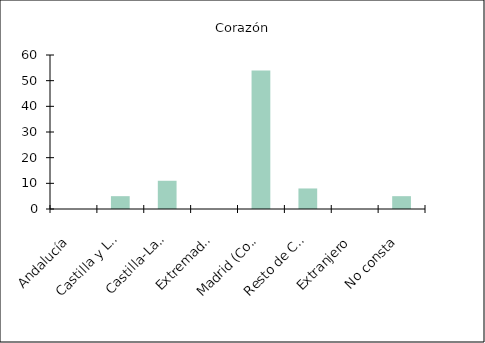
| Category | Corazón |
|---|---|
|    Andalucía | 0 |
|    Castilla y León | 5 |
|    Castilla-La Mancha | 11 |
|    Extremadura | 0 |
|    Madrid (Comunidad de) | 54 |
|    Resto de CCAA | 8 |
|    Extranjero | 0 |
|    No consta | 5 |